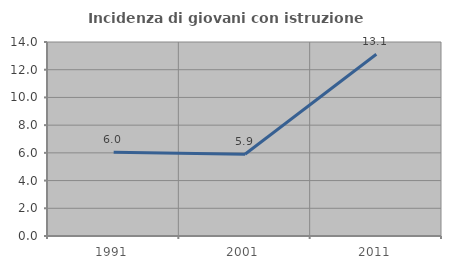
| Category | Incidenza di giovani con istruzione universitaria |
|---|---|
| 1991.0 | 6.037 |
| 2001.0 | 5.899 |
| 2011.0 | 13.113 |